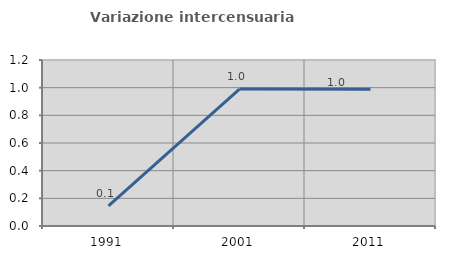
| Category | Variazione intercensuaria annua |
|---|---|
| 1991.0 | 0.146 |
| 2001.0 | 0.99 |
| 2011.0 | 0.989 |